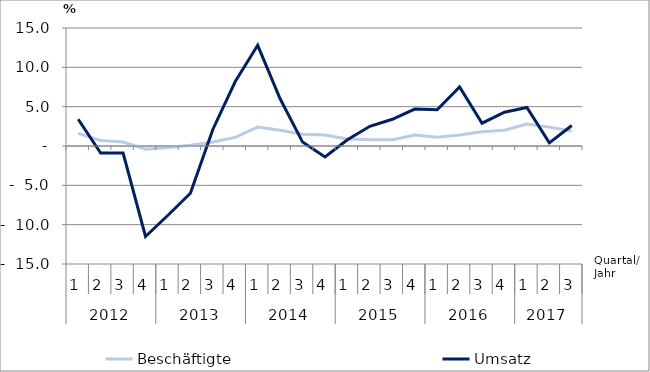
| Category | Beschäftigte | Umsatz |
|---|---|---|
| 0 | 1.6 | 3.4 |
| 1 | 0.7 | -0.9 |
| 2 | 0.5 | -0.9 |
| 3 | -0.4 | -11.5 |
| 4 | -0.2 | -8.8 |
| 5 | 0.1 | -6 |
| 6 | 0.5 | 2.1 |
| 7 | 1.1 | 8.2 |
| 8 | 2.4 | 12.8 |
| 9 | 2 | 6 |
| 10 | 1.5 | 0.5 |
| 11 | 1.4 | -1.4 |
| 12 | 0.9 | 0.8 |
| 13 | 0.8 | 2.5 |
| 14 | 0.8 | 3.4 |
| 15 | 1.4 | 4.7 |
| 16 | 1.1 | 4.6 |
| 17 | 1.4 | 7.5 |
| 18 | 1.8 | 2.9 |
| 19 | 2 | 4.3 |
| 20 | 2.8 | 4.9 |
| 21 | 2.4 | 0.4 |
| 22 | 1.9 | 2.6 |